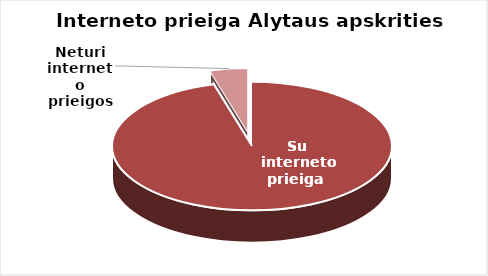
| Category | Series 0 |
|---|---|
| Su interneto prieiga  | 87 |
| Neturi interneto prieigos | 4 |